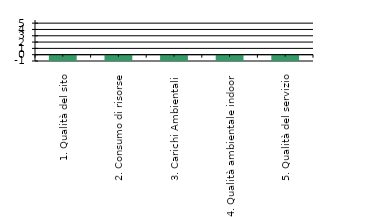
| Category | Series 0 |
|---|---|
| 1. Qualità del sito | -1 |
| 2. Consumo di risorse | -1 |
| 3. Carichi Ambientali  | -1 |
| 4. Qualità ambientale indoor | -1 |
| 5. Qualità del servizio | -1 |